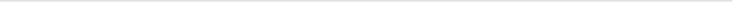
| Category | Series 0 |
|---|---|
| ГБПОУ СТМСХ | 31 |
| ГБПОУ СПЦ №2 | 66 |
| ГБПОУ СахПЦ №1 | 79 |
| ГБПОУ СТС | 82 |
| ГБПОУ «СТС и ЖКХ» (ДФ СТС и ЖКХ) | 85 |
| ГБПОУ СИТ | 88 |
| ГБПОУ СПЦ №3 | 93 |
| ГБПОУ СахГТ | 95 |
| ГБПОУ "СТОСиС" | 96 |
| ГБПОУ "СПЭТ" | 98 |
| ГБПОУ СПЦ №5. | 99 |
| ГБПОУ «СТС и ЖКХ» | 98 |